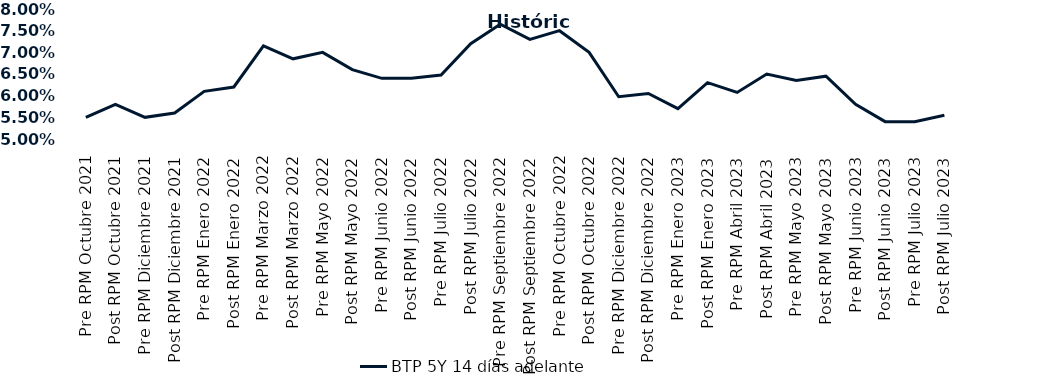
| Category | BTP 5Y 14 días adelante |
|---|---|
| Pre RPM Octubre 2021 | 0.055 |
| Post RPM Octubre 2021 | 0.058 |
| Pre RPM Diciembre 2021 | 0.055 |
| Post RPM Diciembre 2021 | 0.056 |
| Pre RPM Enero 2022 | 0.061 |
| Post RPM Enero 2022 | 0.062 |
| Pre RPM Marzo 2022 | 0.072 |
| Post RPM Marzo 2022 | 0.068 |
| Pre RPM Mayo 2022 | 0.07 |
| Post RPM Mayo 2022 | 0.066 |
| Pre RPM Junio 2022 | 0.064 |
| Post RPM Junio 2022 | 0.064 |
| Pre RPM Julio 2022 | 0.065 |
| Post RPM Julio 2022 | 0.072 |
| Pre RPM Septiembre 2022 | 0.076 |
| Post RPM Septiembre 2022 | 0.073 |
| Pre RPM Octubre 2022 | 0.075 |
| Post RPM Octubre 2022 | 0.07 |
| Pre RPM Diciembre 2022 | 0.06 |
| Post RPM Diciembre 2022 | 0.06 |
| Pre RPM Enero 2023 | 0.057 |
| Post RPM Enero 2023 | 0.063 |
| Pre RPM Abril 2023 | 0.061 |
| Post RPM Abril 2023 | 0.065 |
| Pre RPM Mayo 2023 | 0.064 |
| Post RPM Mayo 2023 | 0.064 |
| Pre RPM Junio 2023 | 0.058 |
| Post RPM Junio 2023 | 0.054 |
| Pre RPM Julio 2023 | 0.054 |
| Post RPM Julio 2023 | 0.056 |